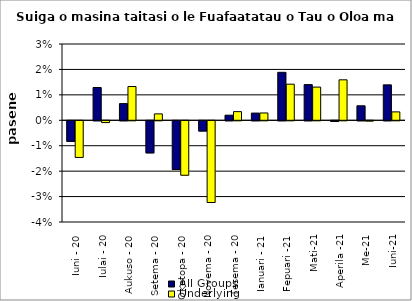
| Category | All Groups | Underlying |
|---|---|---|
| Iuni - 20 | -0.008 | -0.014 |
| Iulai - 20 | 0.013 | -0.001 |
| Aukuso - 20 | 0.007 | 0.013 |
| Setema - 20 | -0.013 | 0.003 |
| Oketopa - 20 | -0.019 | -0.021 |
| Novema - 20 | -0.004 | -0.032 |
| Tesema - 20 | 0.002 | 0.003 |
| Ianuari - 21 | 0.003 | 0.003 |
| Fepuari -21 | 0.019 | 0.014 |
| Mati-21 | 0.014 | 0.013 |
| Aperila -21 | 0 | 0.016 |
| Me-21 | 0.006 | 0 |
| Iuni-21 | 0.014 | 0.003 |